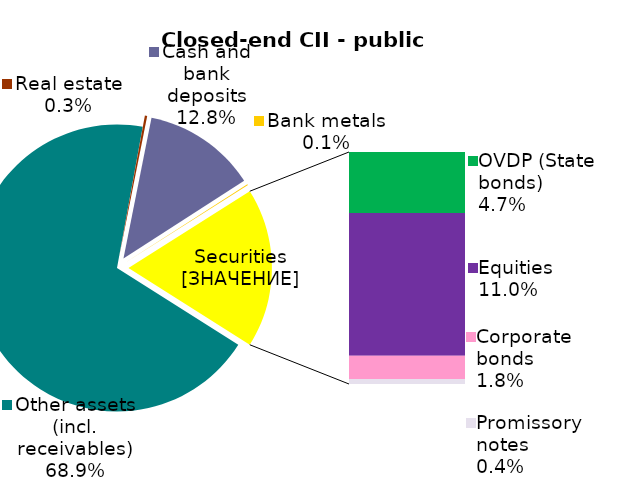
| Category | Series 0 |
|---|---|
| Other assets (incl. receivables) | 0.689 |
| Real estate | 0.003 |
| Cash and bank deposits | 0.128 |
| Bank metals | 0.001 |
| OVDP (State bonds) | 0.047 |
| Equities | 0.11 |
| Corporate bonds | 0.018 |
| Promissory notes | 0.004 |